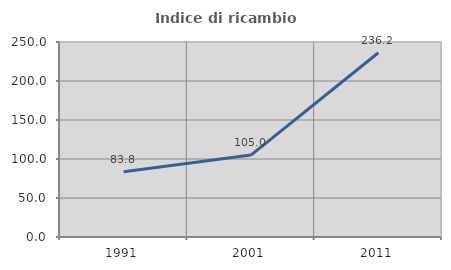
| Category | Indice di ricambio occupazionale  |
|---|---|
| 1991.0 | 83.752 |
| 2001.0 | 105 |
| 2011.0 | 236.226 |